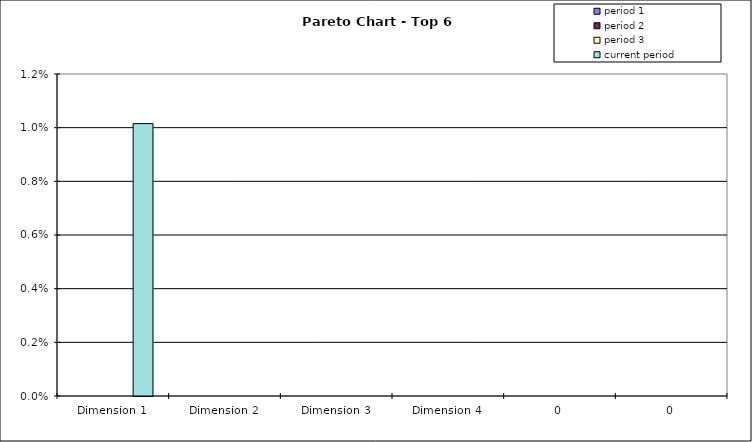
| Category | period 1 | period 2 | period 3 | current period |
|---|---|---|---|---|
| Dimension 1 | 0 | 0 | 0 | 0.01 |
| Dimension 2 | 0 | 0 | 0 | 0 |
| Dimension 3 | 0 | 0 | 0 | 0 |
| Dimension 4 | 0 | 0 | 0 | 0 |
| 0 | 0 | 0 | 0 | 0 |
| 0 | 0 | 0 | 0 | 0 |